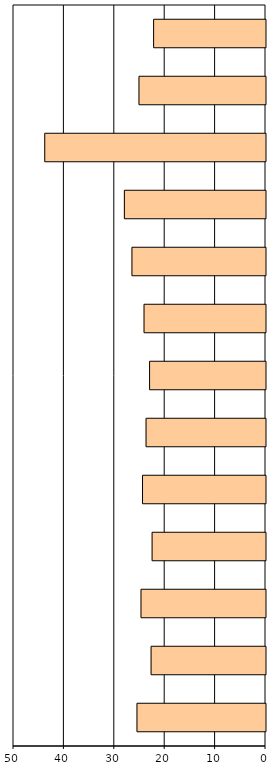
| Category | Series 0 |
|---|---|
| sonstige FB | 25.5 |
| Z00 - Z99 | 22.7 |
| S00 - T98 | 24.7 |
| M00 - M99 | 22.5 |
| L00 - L99 | 24.4 |
| K00 - K93 | 23.7 |
| J00 - J99 | 23 |
| I00 - I99 | 24.1 |
| H00 - H59 | 26.5 |
| G00 - G99 | 28 |
| F00 - F99 | 43.8 |
| E00 - E90 | 25.1 |
| C00 - D48 | 22.2 |